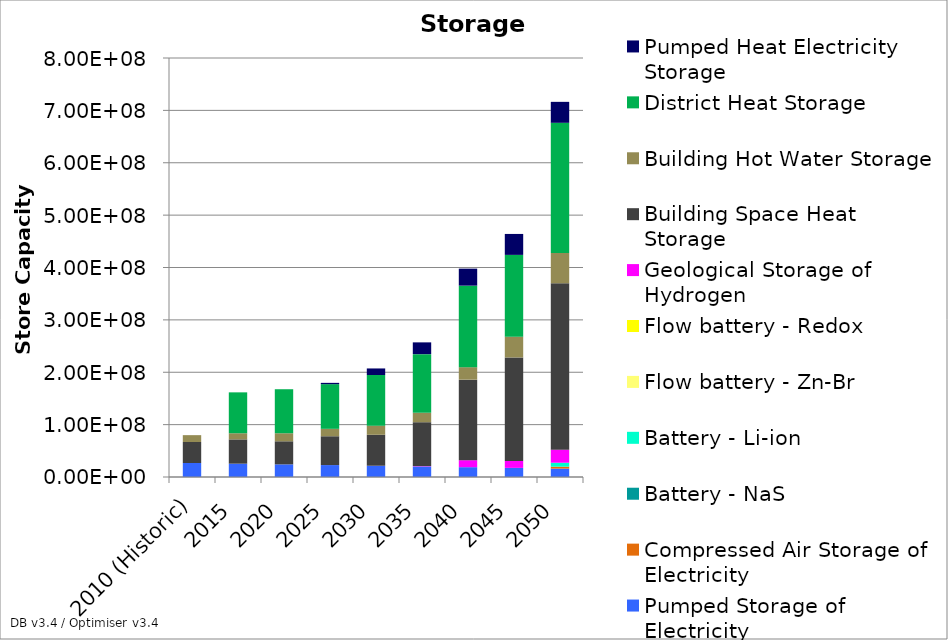
| Category | Pumped Storage of Electricity | Compressed Air Storage of Electricity | Battery - NaS | Battery - Li-ion | Flow battery - Zn-Br | Flow battery - Redox | Geological Storage of Hydrogen | Building Space Heat Storage | Building Hot Water Storage | District Heat Storage | Pumped Heat Electricity Storage |
|---|---|---|---|---|---|---|---|---|---|---|---|
| 2010 (Historic) | 26700000 | 0 | 0 | 0 | 0 | 0 | 0 | 40100000 | 13100000 | 0 | 0 |
| 2015 | 25460000 | 0 | 0 | 0 | 0 | 0 | 0.001 | 46330156.124 | 11749995.887 | 78074429.12 | 0 |
| 2020 | 24120000 | 0 | 0 | 0 | 0 | 0 | 0.001 | 44074372.957 | 15340135.42 | 84037651.487 | 0.001 |
| 2025 | 22780000 | 0.002 | 0 | 0 | 0 | 0 | 0.004 | 55028015.46 | 14163739.871 | 85298721.128 | 2478842.495 |
| 2030 | 21440000 | 0.003 | 0 | 0 | 0 | 0 | 86018.328 | 59097807.421 | 17419652.979 | 96734670.386 | 12478842.495 |
| 2035 | 20100000.001 | 0.003 | 0 | 0 | 0.001 | 0 | 687901.099 | 83807650.36 | 18034900.965 | 111942381.111 | 22478842.494 |
| 2040 | 18760000.001 | 0.003 | 0 | 0 | 0 | 0 | 13299956.281 | 153782686.208 | 23830288.171 | 155678900.754 | 32478842.494 |
| 2045 | 17420000.001 | 0.004 | 0.001 | 0 | 0 | 0 | 13299956.287 | 197540428.96 | 39646823.544 | 156163360.479 | 40000000 |
| 2050 | 16080000.001 | 3650000.004 | 0.001 | 7530699.448 | 0.001 | 0.001 | 24837919.17 | 317807627.986 | 57999536.466 | 248369563.542 | 40000000 |